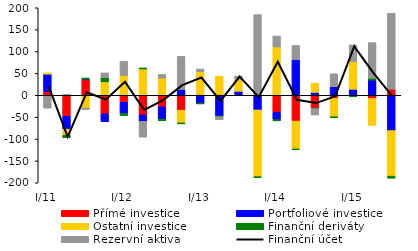
| Category | Přímé investice | Portfoliové investice | Ostatní investice | Finanční deriváty | Rezervní aktiva |
|---|---|---|---|---|---|
| I/11 | 8.394 | 39.909 | 2.964 | -2.567 | -26.789 |
| II | -48.128 | -29.388 | -13.604 | -5.635 | 2.123 |
| III | 35.202 | 1.853 | -28.649 | 2.491 | -3.698 |
| IV | -42.273 | -18.154 | 30.668 | 9.385 | 11.134 |
| I/12 | -16.29 | -25.293 | 45.36 | -4.87 | 32.632 |
| II | -44.641 | -14.957 | 60.168 | 2.453 | -35.982 |
| III | -26.334 | -28.062 | 39.368 | -3.806 | 8.321 |
| IV | -33.997 | 13.465 | -28.955 | -2.395 | 75.502 |
| I/13 | 1.859 | -18.95 | 52.574 | -0.086 | 5.61 |
| II | 1.859 | -47.44 | 41.851 | -1.44 | -6.912 |
| III | 1.859 | 7.148 | 28.263 | -1.061 | 6.889 |
| IV | 1.859 | -33.596 | -152.434 | -2.15 | 182.604 |
| I/14 | -38.685 | -16.995 | 110.469 | -2.764 | 25.08 |
| II | -59.028 | 81.147 | -64.302 | -0.503 | 32.776 |
| III | -29.662 | 6.715 | 20.861 | -0.818 | -14.448 |
| IV | -6.258 | 19.403 | -42.777 | -1.962 | 29.714 |
| I/15 | -2.497 | 13.794 | 63.476 | -0.585 | 38.01 |
| II | -7.16 | 34.761 | -61.587 | 4.391 | 81.243 |
| III | 14.024 | -80.702 | -104.13 | -4.594 | 173.44 |